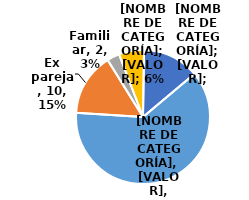
| Category | Series 0 |
|---|---|
| Pareja | 41 |
| Ex pareja | 10 |
| Familiar | 2 |
| Conocido | 4 |
| Desconocido | 9 |